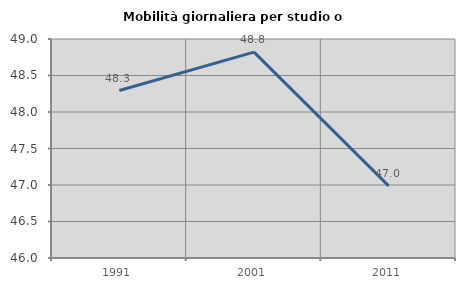
| Category | Mobilità giornaliera per studio o lavoro |
|---|---|
| 1991.0 | 48.294 |
| 2001.0 | 48.819 |
| 2011.0 | 46.988 |